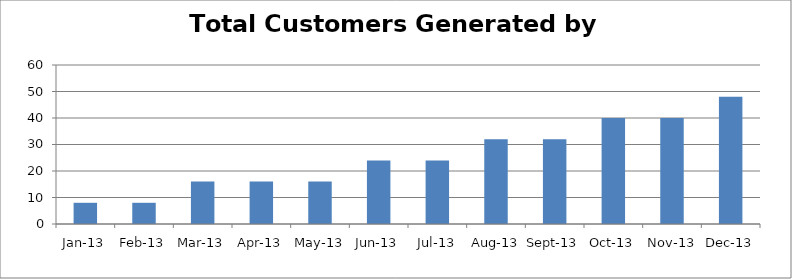
| Category | Total |
|---|---|
| 2013-01-13 | 8 |
| 2013-02-13 | 8 |
| 2013-03-13 | 16 |
| 2013-04-13 | 16 |
| 2013-05-13 | 16 |
| 2013-06-13 | 24 |
| 2013-07-13 | 24 |
| 2013-08-13 | 32 |
| 2013-09-13 | 32 |
| 2013-10-13 | 40 |
| 2013-11-13 | 40 |
| 2013-12-13 | 48 |